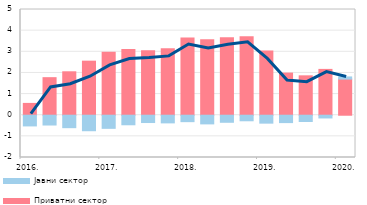
| Category | Приватни сектор | Јавни сектор |
|---|---|---|
| 2016. | 0.559 | -0.507 |
| II | 1.776 | -0.463 |
| III | 2.053 | -0.589 |
| IV | 2.556 | -0.733 |
| 2017. | 2.977 | -0.621 |
| II | 3.109 | -0.452 |
| III | 3.055 | -0.347 |
| IV | 3.145 | -0.363 |
| 2018. | 3.649 | -0.305 |
| II | 3.567 | -0.411 |
| III | 3.668 | -0.334 |
| IV | 3.71 | -0.263 |
| 2019. | 3.039 | -0.375 |
| II | 1.992 | -0.349 |
| III | 1.862 | -0.298 |
| IV | 2.168 | -0.13 |
| 2020. | 1.708 | 0.102 |